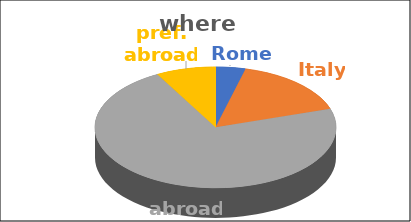
| Category | where | Series 1 | Series 2 | Series 3 | Series 4 |
|---|---|---|---|---|---|
| Rome | 0.04 |  |  |  |  |
| Italy | 0.16 |  |  |  |  |
| abroad | 0.72 |  |  |  |  |
| pref. abroad | 0.08 |  |  |  |  |